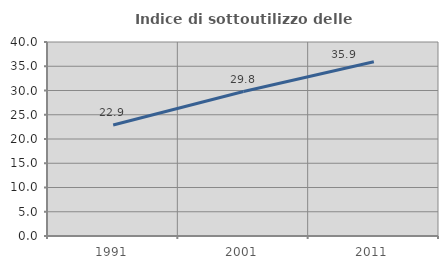
| Category | Indice di sottoutilizzo delle abitazioni  |
|---|---|
| 1991.0 | 22.889 |
| 2001.0 | 29.78 |
| 2011.0 | 35.915 |